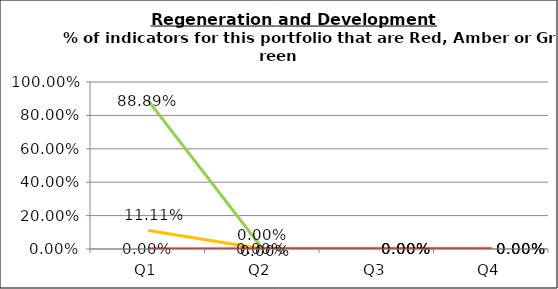
| Category | Green | Amber | Red |
|---|---|---|---|
| Q1 | 0.889 | 0.111 | 0 |
| Q2 | 0 | 0 | 0 |
| Q3 | 0 | 0 | 0 |
| Q4 | 0 | 0 | 0 |